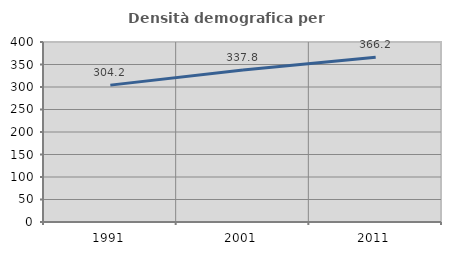
| Category | Densità demografica |
|---|---|
| 1991.0 | 304.159 |
| 2001.0 | 337.83 |
| 2011.0 | 366.16 |